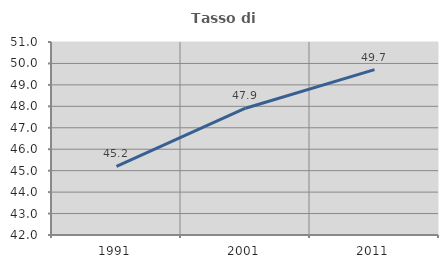
| Category | Tasso di occupazione   |
|---|---|
| 1991.0 | 45.198 |
| 2001.0 | 47.911 |
| 2011.0 | 49.714 |